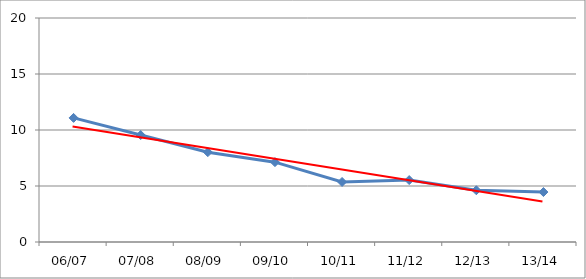
| Category | Series 0 |
|---|---|
| 06/07 | 11.08 |
| 07/08 | 9.55 |
| 08/09 | 8.02 |
| 09/10 | 7.13 |
| 10/11 | 5.36 |
| 11/12 | 5.53 |
| 12/13 | 4.62 |
| 13/14 | 4.46 |